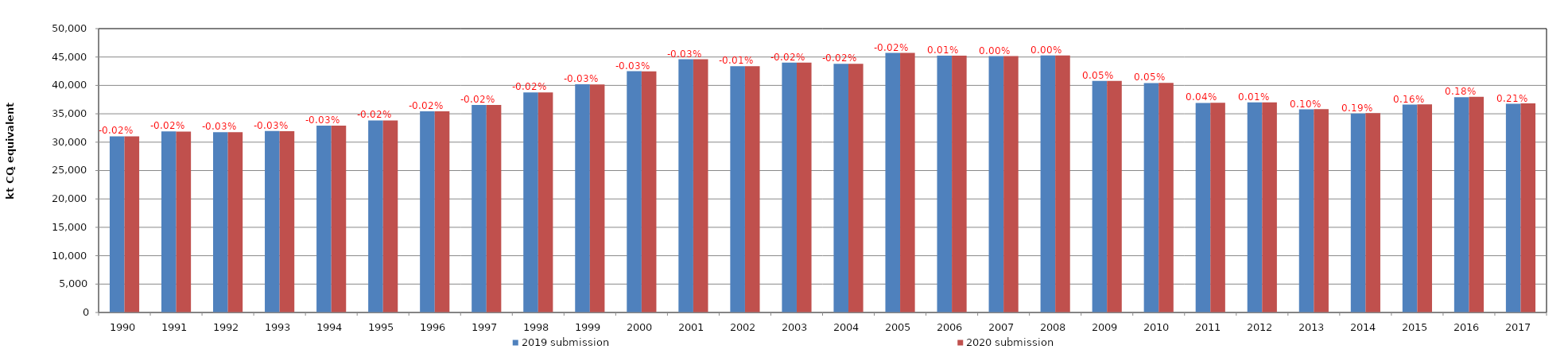
| Category | 2019 submission | 2020 submission |
|---|---|---|
| 1990.0 | 31027.023 | 31022.103 |
| 1991.0 | 31880.971 | 31873.07 |
| 1992.0 | 31772.993 | 31764.6 |
| 1993.0 | 31952.085 | 31943.191 |
| 1994.0 | 32920.906 | 32912.372 |
| 1995.0 | 33831.936 | 33824.925 |
| 1996.0 | 35445.971 | 35439.435 |
| 1997.0 | 36556.321 | 36550.493 |
| 1998.0 | 38770.876 | 38763.594 |
| 1999.0 | 40189.787 | 40177.369 |
| 2000.0 | 42497.946 | 42485.772 |
| 2001.0 | 44605.303 | 44593.694 |
| 2002.0 | 43379.203 | 43375.183 |
| 2003.0 | 44016.014 | 44008.831 |
| 2004.0 | 43814.79 | 43807.997 |
| 2005.0 | 45720.087 | 45711.735 |
| 2006.0 | 45221.378 | 45227.68 |
| 2007.0 | 45163.601 | 45162.457 |
| 2008.0 | 45272.347 | 45270.62 |
| 2009.0 | 40777.075 | 40798.36 |
| 2010.0 | 40409.688 | 40427.936 |
| 2011.0 | 36909.405 | 36925.881 |
| 2012.0 | 36995.967 | 36998.841 |
| 2013.0 | 35780.248 | 35816.79 |
| 2014.0 | 35049.15 | 35114.719 |
| 2015.0 | 36607.52 | 36665.906 |
| 2016.0 | 37930.04 | 37998.083 |
| 2017.0 | 36762.358 | 36840.011 |